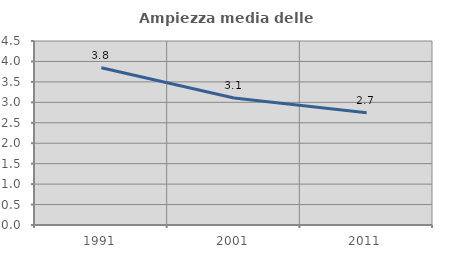
| Category | Ampiezza media delle famiglie |
|---|---|
| 1991.0 | 3.847 |
| 2001.0 | 3.105 |
| 2011.0 | 2.745 |